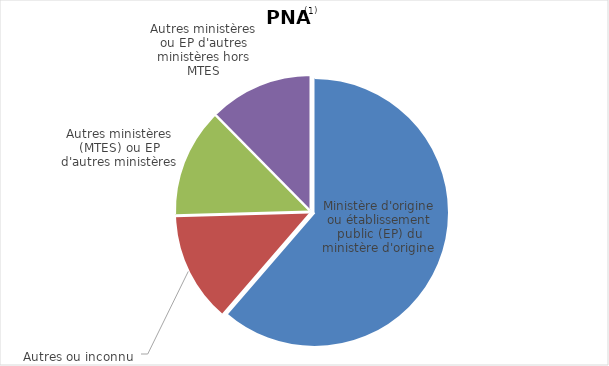
| Category | Position normale d'activité(1) |
|---|---|
| Ministère d'origine ou établissement public (EP) du ministère d'origine | 61.341 |
| Autres ou inconnu  | 13.221 |
| Autres ministères (MTES) ou EP d'autres ministères | 13.04 |
| Autres ministères ou EP d'autres ministères hors MTES | 12.398 |